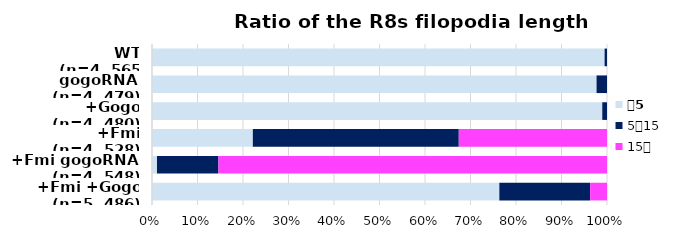
| Category | 〜5 | 5〜15 | 15〜 |
|---|---|---|---|
|  +Fmi +Gogo
(n=5, 486) | 371 | 97 | 18 |
|  +Fmi gogoRNAi
(n=4, 548) | 6 | 74 | 468 |
|  +Fmi
(n=4, 528) | 117 | 239 | 172 |
|  +Gogo
(n=4, 480) | 475 | 5 | 0 |
| gogoRNAi
(n=4, 479) | 468 | 11 | 0 |
| WT
(n=4, 565 axons)) | 562 | 3 | 0 |